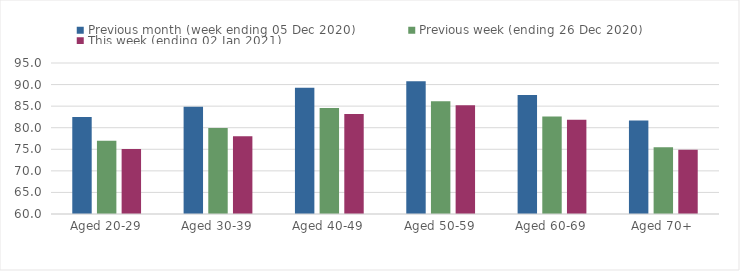
| Category | Previous month (week ending 05 Dec 2020) | Previous week (ending 26 Dec 2020) | This week (ending 02 Jan 2021) |
|---|---|---|---|
| Aged 20-29 | 82.49 | 76.98 | 75.09 |
| Aged 30-39 | 84.84 | 79.94 | 78.01 |
| Aged 40-49 | 89.25 | 84.57 | 83.16 |
| Aged 50-59 | 90.76 | 86.14 | 85.18 |
| Aged 60-69 | 87.58 | 82.61 | 81.85 |
| Aged 70+ | 81.68 | 75.49 | 74.91 |